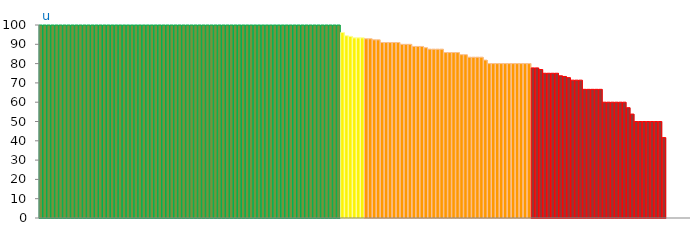
| Category | Top Quartile | 2nd Quartile | 3rd Quartile | Bottom Quartile | Series 4 |
|---|---|---|---|---|---|
|  | 100 | 0 | 0 | 0 | 100 |
|  | 100 | 0 | 0 | 0 | 100 |
| u | 100 | 0 | 0 | 0 | 100 |